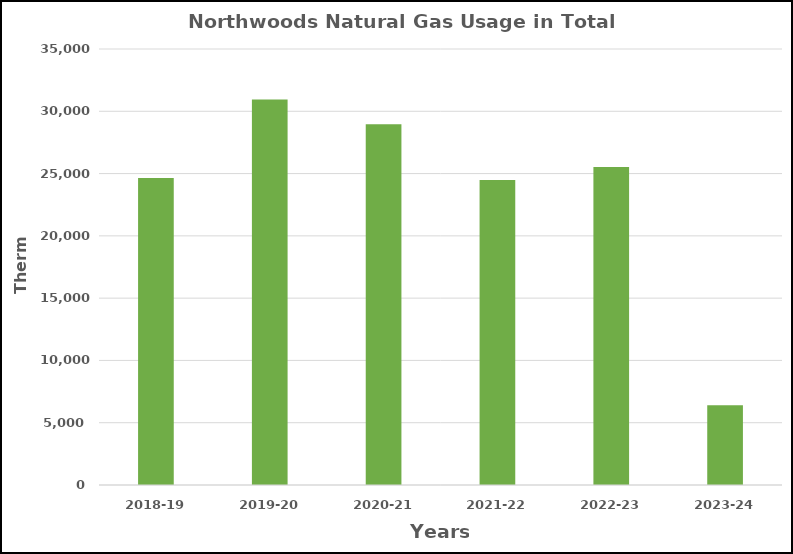
| Category | Series 0 |
|---|---|
| 2018-19 | 24640 |
| 2019-20 | 30938 |
| 2020-21 | 28950 |
| 2021-22 | 24492 |
| 2022-23 | 25535.44 |
| 2023-24 | 6398 |